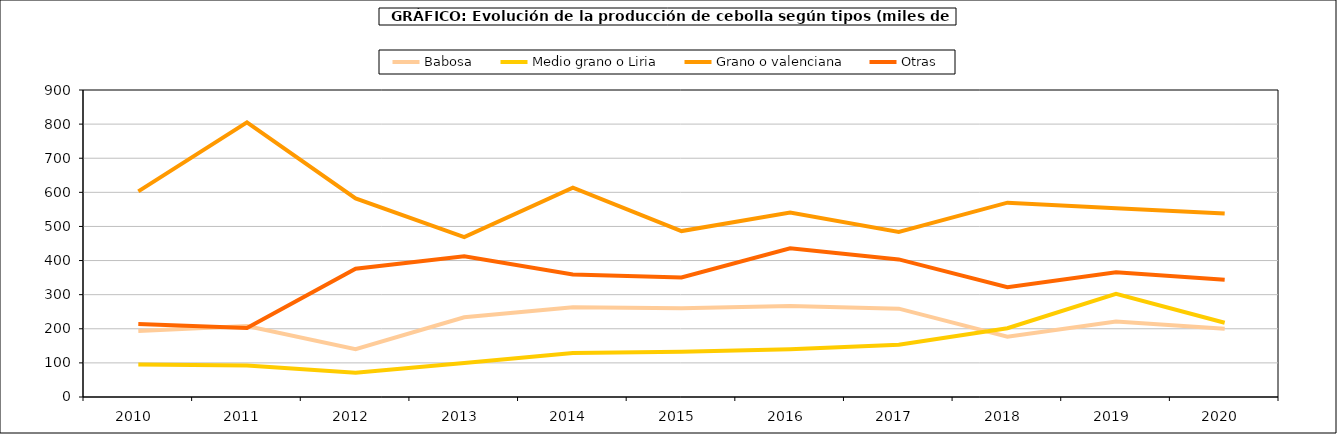
| Category | Babosa | Medio grano o Liria | Grano o valenciana | Otras |
|---|---|---|---|---|
| 2010.0 | 193.415 | 95.014 | 602.708 | 213.99 |
| 2011.0 | 207.933 | 92.32 | 804.939 | 202.339 |
| 2012.0 | 140.272 | 70.819 | 582.337 | 376.293 |
| 2013.0 | 233.875 | 99.562 | 468.759 | 412.305 |
| 2014.0 | 263.155 | 128.911 | 613.774 | 358.887 |
| 2015.0 | 260.238 | 132.601 | 486.456 | 350.547 |
| 2016.0 | 267.04 | 140.214 | 541.052 | 435.792 |
| 2017.0 | 258.956 | 153.086 | 484.161 | 403.331 |
| 2018.0 | 177.049 | 201.455 | 569.731 | 321.921 |
| 2019.0 | 221.244 | 302.403 | 553.585 | 365.955 |
| 2020.0 | 200.422 | 217.694 | 537.684 | 343.923 |